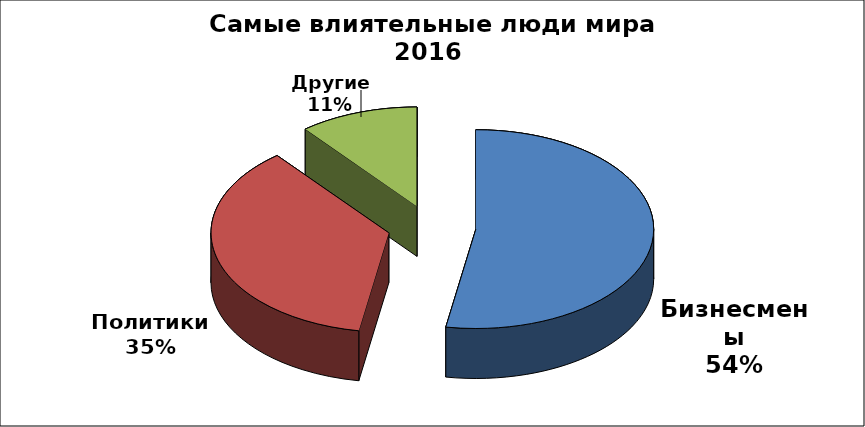
| Category | Series 0 |
|---|---|
| Бизнесмены | 39 |
| Политики | 27 |
| Другие | 8 |